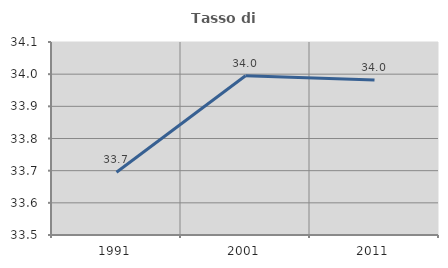
| Category | Tasso di occupazione   |
|---|---|
| 1991.0 | 33.695 |
| 2001.0 | 33.995 |
| 2011.0 | 33.982 |